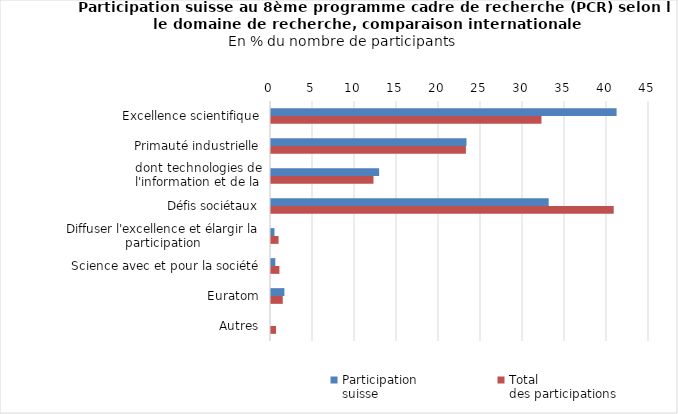
| Category | Participation
suisse | Total 
des participations |
|---|---|---|
| Excellence scientifique | 41.143 | 32.2 |
| Primauté industrielle | 23.275 | 23.2 |
| dont technologies de l'information et de la communication | 12.873 | 12.2 |
| Défis sociétaux | 33.059 | 40.8 |
| Diffuser l'excellence et élargir la participation | 0.412 | 0.9 |
| Science avec et pour la société | 0.515 | 1 |
| Euratom | 1.596 | 1.4 |
| Autres | 0 | 0.6 |